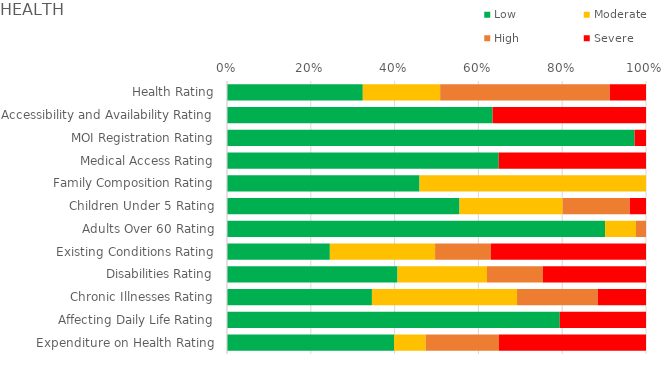
| Category | Low | Moderate | High | Severe |
|---|---|---|---|---|
| Health Rating | 0.324 | 0.185 | 0.405 | 0.086 |
| Accessibility and Availability Rating | 0.634 | 0 | 0 | 0.366 |
| MOI Registration Rating | 0.973 | 0 | 0 | 0.027 |
| Medical Access Rating | 0.648 | 0 | 0 | 0.352 |
| Family Composition Rating | 0.459 | 0.541 | 0 | 0 |
| Children Under 5 Rating | 0.555 | 0.246 | 0.16 | 0.039 |
| Adults Over 60 Rating | 0.902 | 0.074 | 0.024 | 0 |
| Existing Conditions Rating | 0.245 | 0.251 | 0.133 | 0.37 |
| Disabilities Rating | 0.407 | 0.214 | 0.133 | 0.246 |
| Chronic Illnesses Rating | 0.346 | 0.346 | 0.193 | 0.115 |
| Affecting Daily Life Rating | 0.794 | 0 | 0 | 0.206 |
| Expenditure on Health Rating | 0.399 | 0.076 | 0.175 | 0.351 |